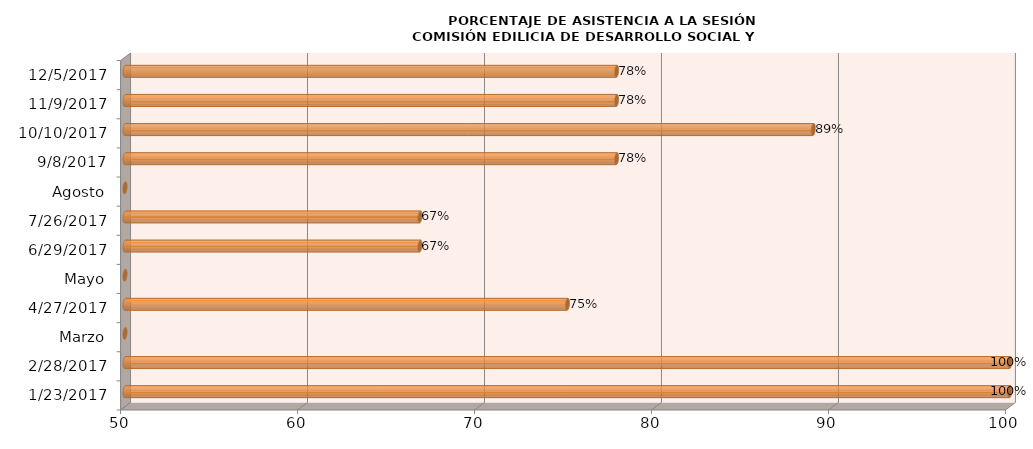
| Category | Series 0 |
|---|---|
| 23/01/2017 | 100 |
| 28/02/2017 | 100 |
| Marzo | 0 |
| 27/04/2017 | 75 |
| Mayo | 0 |
| 29/06/2017 | 66.667 |
| 26/07/2017 | 66.667 |
| Agosto | 0 |
| 08/09/2017 | 77.778 |
| 10/10/2017 | 88.889 |
| 09/11/2017 | 77.778 |
| 05/12/2017 | 77.778 |